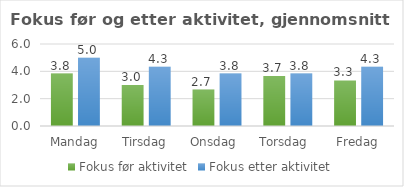
| Category | Fokus før aktivitet | Fokus etter aktivitet |
|---|---|---|
| Mandag | 3.833 | 5 |
| Tirsdag | 3 | 4.333 |
| Onsdag  | 2.667 | 3.833 |
| Torsdag  | 3.667 | 3.833 |
| Fredag | 3.333 | 4.333 |